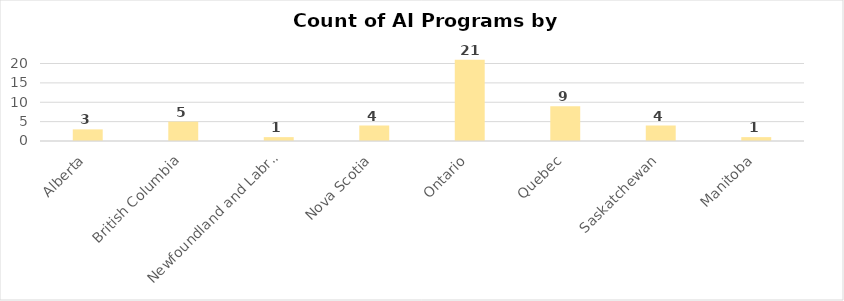
| Category | Series 0 |
|---|---|
| Alberta | 3 |
| British Columbia | 5 |
| Newfoundland and Labrador | 1 |
| Nova Scotia | 4 |
| Ontario | 21 |
| Quebec | 9 |
| Saskatchewan | 4 |
| Manitoba | 1 |